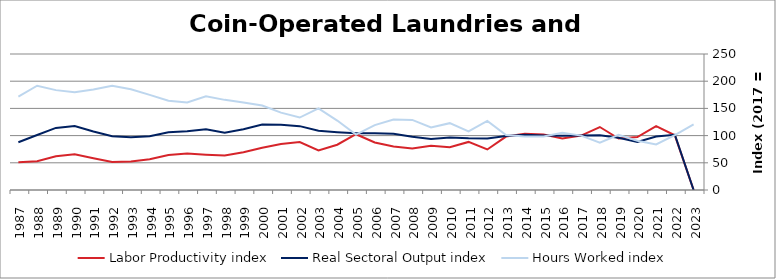
| Category | Labor Productivity index | Real Sectoral Output index | Hours Worked index |
|---|---|---|---|
| 2023.0 | 0 | 0 | 120.756 |
| 2022.0 | 100.487 | 101.519 | 101.027 |
| 2021.0 | 117.445 | 98.419 | 83.8 |
| 2020.0 | 97.267 | 88.105 | 90.58 |
| 2019.0 | 94.661 | 96.152 | 101.574 |
| 2018.0 | 115.791 | 100.816 | 87.067 |
| 2017.0 | 100 | 100 | 100 |
| 2016.0 | 94.837 | 99.73 | 105.159 |
| 2015.0 | 102.007 | 100.29 | 98.317 |
| 2014.0 | 103.421 | 101.562 | 98.202 |
| 2013.0 | 98.237 | 99.36 | 101.142 |
| 2012.0 | 74.499 | 94.546 | 126.909 |
| 2011.0 | 88.384 | 95.133 | 107.635 |
| 2010.0 | 78.573 | 96.526 | 122.848 |
| 2009.0 | 81.513 | 93.755 | 115.019 |
| 2008.0 | 76.165 | 98.087 | 128.782 |
| 2007.0 | 79.861 | 103.487 | 129.584 |
| 2006.0 | 87.456 | 104.317 | 119.28 |
| 2005.0 | 102.502 | 104.436 | 101.887 |
| 2004.0 | 83.252 | 106.3 | 127.684 |
| 2003.0 | 72.634 | 108.912 | 149.946 |
| 2002.0 | 88.124 | 117.383 | 133.201 |
| 2001.0 | 84.471 | 120.148 | 142.236 |
| 2000.0 | 77.512 | 120.335 | 155.248 |
| 1999.0 | 69.361 | 111.629 | 160.94 |
| 1998.0 | 63.598 | 105.375 | 165.689 |
| 1997.0 | 64.921 | 111.867 | 172.313 |
| 1996.0 | 66.993 | 107.824 | 160.947 |
| 1995.0 | 64.514 | 105.945 | 164.221 |
| 1994.0 | 56.468 | 98.725 | 174.834 |
| 1993.0 | 52.387 | 97.006 | 185.171 |
| 1992.0 | 51.464 | 98.66 | 191.707 |
| 1991.0 | 58.271 | 107.59 | 184.639 |
| 1990.0 | 65.503 | 117.79 | 179.824 |
| 1989.0 | 62.143 | 114.092 | 183.596 |
| 1988.0 | 52.723 | 101.066 | 191.695 |
| 1987.0 | 51.202 | 87.84 | 171.558 |